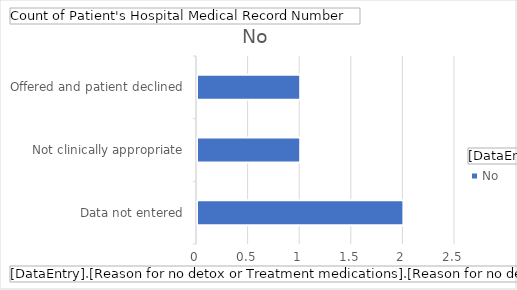
| Category | No |
|---|---|
| Data not entered | 2 |
| Not clinically appropriate | 1 |
| Offered and patient declined | 1 |